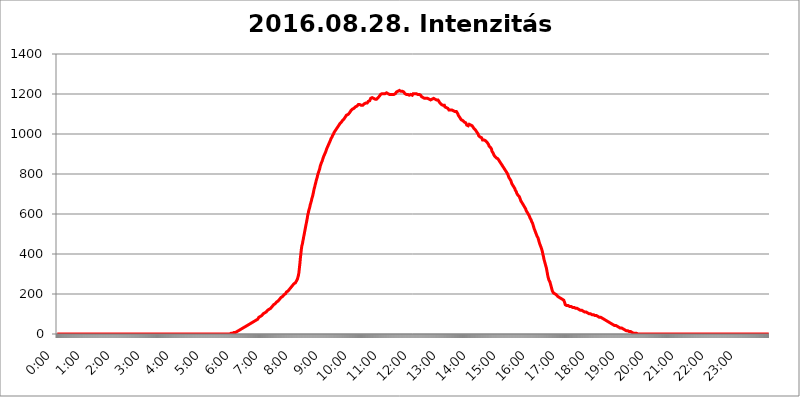
| Category | 2016.08.28. Intenzitás [W/m^2] |
|---|---|
| 0.0 | 0 |
| 0.0006944444444444445 | 0 |
| 0.001388888888888889 | 0 |
| 0.0020833333333333333 | 0 |
| 0.002777777777777778 | 0 |
| 0.003472222222222222 | 0 |
| 0.004166666666666667 | 0 |
| 0.004861111111111111 | 0 |
| 0.005555555555555556 | 0 |
| 0.0062499999999999995 | 0 |
| 0.006944444444444444 | 0 |
| 0.007638888888888889 | 0 |
| 0.008333333333333333 | 0 |
| 0.009027777777777779 | 0 |
| 0.009722222222222222 | 0 |
| 0.010416666666666666 | 0 |
| 0.011111111111111112 | 0 |
| 0.011805555555555555 | 0 |
| 0.012499999999999999 | 0 |
| 0.013194444444444444 | 0 |
| 0.013888888888888888 | 0 |
| 0.014583333333333332 | 0 |
| 0.015277777777777777 | 0 |
| 0.015972222222222224 | 0 |
| 0.016666666666666666 | 0 |
| 0.017361111111111112 | 0 |
| 0.018055555555555557 | 0 |
| 0.01875 | 0 |
| 0.019444444444444445 | 0 |
| 0.02013888888888889 | 0 |
| 0.020833333333333332 | 0 |
| 0.02152777777777778 | 0 |
| 0.022222222222222223 | 0 |
| 0.02291666666666667 | 0 |
| 0.02361111111111111 | 0 |
| 0.024305555555555556 | 0 |
| 0.024999999999999998 | 0 |
| 0.025694444444444447 | 0 |
| 0.02638888888888889 | 0 |
| 0.027083333333333334 | 0 |
| 0.027777777777777776 | 0 |
| 0.02847222222222222 | 0 |
| 0.029166666666666664 | 0 |
| 0.029861111111111113 | 0 |
| 0.030555555555555555 | 0 |
| 0.03125 | 0 |
| 0.03194444444444445 | 0 |
| 0.03263888888888889 | 0 |
| 0.03333333333333333 | 0 |
| 0.034027777777777775 | 0 |
| 0.034722222222222224 | 0 |
| 0.035416666666666666 | 0 |
| 0.036111111111111115 | 0 |
| 0.03680555555555556 | 0 |
| 0.0375 | 0 |
| 0.03819444444444444 | 0 |
| 0.03888888888888889 | 0 |
| 0.03958333333333333 | 0 |
| 0.04027777777777778 | 0 |
| 0.04097222222222222 | 0 |
| 0.041666666666666664 | 0 |
| 0.042361111111111106 | 0 |
| 0.04305555555555556 | 0 |
| 0.043750000000000004 | 0 |
| 0.044444444444444446 | 0 |
| 0.04513888888888889 | 0 |
| 0.04583333333333334 | 0 |
| 0.04652777777777778 | 0 |
| 0.04722222222222222 | 0 |
| 0.04791666666666666 | 0 |
| 0.04861111111111111 | 0 |
| 0.049305555555555554 | 0 |
| 0.049999999999999996 | 0 |
| 0.05069444444444445 | 0 |
| 0.051388888888888894 | 0 |
| 0.052083333333333336 | 0 |
| 0.05277777777777778 | 0 |
| 0.05347222222222222 | 0 |
| 0.05416666666666667 | 0 |
| 0.05486111111111111 | 0 |
| 0.05555555555555555 | 0 |
| 0.05625 | 0 |
| 0.05694444444444444 | 0 |
| 0.057638888888888885 | 0 |
| 0.05833333333333333 | 0 |
| 0.05902777777777778 | 0 |
| 0.059722222222222225 | 0 |
| 0.06041666666666667 | 0 |
| 0.061111111111111116 | 0 |
| 0.06180555555555556 | 0 |
| 0.0625 | 0 |
| 0.06319444444444444 | 0 |
| 0.06388888888888888 | 0 |
| 0.06458333333333334 | 0 |
| 0.06527777777777778 | 0 |
| 0.06597222222222222 | 0 |
| 0.06666666666666667 | 0 |
| 0.06736111111111111 | 0 |
| 0.06805555555555555 | 0 |
| 0.06874999999999999 | 0 |
| 0.06944444444444443 | 0 |
| 0.07013888888888889 | 0 |
| 0.07083333333333333 | 0 |
| 0.07152777777777779 | 0 |
| 0.07222222222222223 | 0 |
| 0.07291666666666667 | 0 |
| 0.07361111111111111 | 0 |
| 0.07430555555555556 | 0 |
| 0.075 | 0 |
| 0.07569444444444444 | 0 |
| 0.0763888888888889 | 0 |
| 0.07708333333333334 | 0 |
| 0.07777777777777778 | 0 |
| 0.07847222222222222 | 0 |
| 0.07916666666666666 | 0 |
| 0.0798611111111111 | 0 |
| 0.08055555555555556 | 0 |
| 0.08125 | 0 |
| 0.08194444444444444 | 0 |
| 0.08263888888888889 | 0 |
| 0.08333333333333333 | 0 |
| 0.08402777777777777 | 0 |
| 0.08472222222222221 | 0 |
| 0.08541666666666665 | 0 |
| 0.08611111111111112 | 0 |
| 0.08680555555555557 | 0 |
| 0.08750000000000001 | 0 |
| 0.08819444444444445 | 0 |
| 0.08888888888888889 | 0 |
| 0.08958333333333333 | 0 |
| 0.09027777777777778 | 0 |
| 0.09097222222222222 | 0 |
| 0.09166666666666667 | 0 |
| 0.09236111111111112 | 0 |
| 0.09305555555555556 | 0 |
| 0.09375 | 0 |
| 0.09444444444444444 | 0 |
| 0.09513888888888888 | 0 |
| 0.09583333333333333 | 0 |
| 0.09652777777777777 | 0 |
| 0.09722222222222222 | 0 |
| 0.09791666666666667 | 0 |
| 0.09861111111111111 | 0 |
| 0.09930555555555555 | 0 |
| 0.09999999999999999 | 0 |
| 0.10069444444444443 | 0 |
| 0.1013888888888889 | 0 |
| 0.10208333333333335 | 0 |
| 0.10277777777777779 | 0 |
| 0.10347222222222223 | 0 |
| 0.10416666666666667 | 0 |
| 0.10486111111111111 | 0 |
| 0.10555555555555556 | 0 |
| 0.10625 | 0 |
| 0.10694444444444444 | 0 |
| 0.1076388888888889 | 0 |
| 0.10833333333333334 | 0 |
| 0.10902777777777778 | 0 |
| 0.10972222222222222 | 0 |
| 0.1111111111111111 | 0 |
| 0.11180555555555556 | 0 |
| 0.11180555555555556 | 0 |
| 0.1125 | 0 |
| 0.11319444444444444 | 0 |
| 0.11388888888888889 | 0 |
| 0.11458333333333333 | 0 |
| 0.11527777777777777 | 0 |
| 0.11597222222222221 | 0 |
| 0.11666666666666665 | 0 |
| 0.1173611111111111 | 0 |
| 0.11805555555555557 | 0 |
| 0.11944444444444445 | 0 |
| 0.12013888888888889 | 0 |
| 0.12083333333333333 | 0 |
| 0.12152777777777778 | 0 |
| 0.12222222222222223 | 0 |
| 0.12291666666666667 | 0 |
| 0.12291666666666667 | 0 |
| 0.12361111111111112 | 0 |
| 0.12430555555555556 | 0 |
| 0.125 | 0 |
| 0.12569444444444444 | 0 |
| 0.12638888888888888 | 0 |
| 0.12708333333333333 | 0 |
| 0.16875 | 0 |
| 0.12847222222222224 | 0 |
| 0.12916666666666668 | 0 |
| 0.12986111111111112 | 0 |
| 0.13055555555555556 | 0 |
| 0.13125 | 0 |
| 0.13194444444444445 | 0 |
| 0.1326388888888889 | 0 |
| 0.13333333333333333 | 0 |
| 0.13402777777777777 | 0 |
| 0.13402777777777777 | 0 |
| 0.13472222222222222 | 0 |
| 0.13541666666666666 | 0 |
| 0.1361111111111111 | 0 |
| 0.13749999999999998 | 0 |
| 0.13819444444444443 | 0 |
| 0.1388888888888889 | 0 |
| 0.13958333333333334 | 0 |
| 0.14027777777777778 | 0 |
| 0.14097222222222222 | 0 |
| 0.14166666666666666 | 0 |
| 0.1423611111111111 | 0 |
| 0.14305555555555557 | 0 |
| 0.14375000000000002 | 0 |
| 0.14444444444444446 | 0 |
| 0.1451388888888889 | 0 |
| 0.1451388888888889 | 0 |
| 0.14652777777777778 | 0 |
| 0.14722222222222223 | 0 |
| 0.14791666666666667 | 0 |
| 0.1486111111111111 | 0 |
| 0.14930555555555555 | 0 |
| 0.15 | 0 |
| 0.15069444444444444 | 0 |
| 0.15138888888888888 | 0 |
| 0.15208333333333332 | 0 |
| 0.15277777777777776 | 0 |
| 0.15347222222222223 | 0 |
| 0.15416666666666667 | 0 |
| 0.15486111111111112 | 0 |
| 0.15555555555555556 | 0 |
| 0.15625 | 0 |
| 0.15694444444444444 | 0 |
| 0.15763888888888888 | 0 |
| 0.15833333333333333 | 0 |
| 0.15902777777777777 | 0 |
| 0.15972222222222224 | 0 |
| 0.16041666666666668 | 0 |
| 0.16111111111111112 | 0 |
| 0.16180555555555556 | 0 |
| 0.1625 | 0 |
| 0.16319444444444445 | 0 |
| 0.1638888888888889 | 0 |
| 0.16458333333333333 | 0 |
| 0.16527777777777777 | 0 |
| 0.16597222222222222 | 0 |
| 0.16666666666666666 | 0 |
| 0.1673611111111111 | 0 |
| 0.16805555555555554 | 0 |
| 0.16874999999999998 | 0 |
| 0.16944444444444443 | 0 |
| 0.17013888888888887 | 0 |
| 0.1708333333333333 | 0 |
| 0.17152777777777775 | 0 |
| 0.17222222222222225 | 0 |
| 0.1729166666666667 | 0 |
| 0.17361111111111113 | 0 |
| 0.17430555555555557 | 0 |
| 0.17500000000000002 | 0 |
| 0.17569444444444446 | 0 |
| 0.1763888888888889 | 0 |
| 0.17708333333333334 | 0 |
| 0.17777777777777778 | 0 |
| 0.17847222222222223 | 0 |
| 0.17916666666666667 | 0 |
| 0.1798611111111111 | 0 |
| 0.18055555555555555 | 0 |
| 0.18125 | 0 |
| 0.18194444444444444 | 0 |
| 0.1826388888888889 | 0 |
| 0.18333333333333335 | 0 |
| 0.1840277777777778 | 0 |
| 0.18472222222222223 | 0 |
| 0.18541666666666667 | 0 |
| 0.18611111111111112 | 0 |
| 0.18680555555555556 | 0 |
| 0.1875 | 0 |
| 0.18819444444444444 | 0 |
| 0.18888888888888888 | 0 |
| 0.18958333333333333 | 0 |
| 0.19027777777777777 | 0 |
| 0.1909722222222222 | 0 |
| 0.19166666666666665 | 0 |
| 0.19236111111111112 | 0 |
| 0.19305555555555554 | 0 |
| 0.19375 | 0 |
| 0.19444444444444445 | 0 |
| 0.1951388888888889 | 0 |
| 0.19583333333333333 | 0 |
| 0.19652777777777777 | 0 |
| 0.19722222222222222 | 0 |
| 0.19791666666666666 | 0 |
| 0.1986111111111111 | 0 |
| 0.19930555555555554 | 0 |
| 0.19999999999999998 | 0 |
| 0.20069444444444443 | 0 |
| 0.20138888888888887 | 0 |
| 0.2020833333333333 | 0 |
| 0.2027777777777778 | 0 |
| 0.2034722222222222 | 0 |
| 0.2041666666666667 | 0 |
| 0.20486111111111113 | 0 |
| 0.20555555555555557 | 0 |
| 0.20625000000000002 | 0 |
| 0.20694444444444446 | 0 |
| 0.2076388888888889 | 0 |
| 0.20833333333333334 | 0 |
| 0.20902777777777778 | 0 |
| 0.20972222222222223 | 0 |
| 0.21041666666666667 | 0 |
| 0.2111111111111111 | 0 |
| 0.21180555555555555 | 0 |
| 0.2125 | 0 |
| 0.21319444444444444 | 0 |
| 0.2138888888888889 | 0 |
| 0.21458333333333335 | 0 |
| 0.2152777777777778 | 0 |
| 0.21597222222222223 | 0 |
| 0.21666666666666667 | 0 |
| 0.21736111111111112 | 0 |
| 0.21805555555555556 | 0 |
| 0.21875 | 0 |
| 0.21944444444444444 | 0 |
| 0.22013888888888888 | 0 |
| 0.22083333333333333 | 0 |
| 0.22152777777777777 | 0 |
| 0.2222222222222222 | 0 |
| 0.22291666666666665 | 0 |
| 0.2236111111111111 | 0 |
| 0.22430555555555556 | 0 |
| 0.225 | 0 |
| 0.22569444444444445 | 0 |
| 0.2263888888888889 | 0 |
| 0.22708333333333333 | 0 |
| 0.22777777777777777 | 0 |
| 0.22847222222222222 | 0 |
| 0.22916666666666666 | 0 |
| 0.2298611111111111 | 0 |
| 0.23055555555555554 | 0 |
| 0.23124999999999998 | 0 |
| 0.23194444444444443 | 0 |
| 0.23263888888888887 | 0 |
| 0.2333333333333333 | 0 |
| 0.2340277777777778 | 0 |
| 0.2347222222222222 | 0 |
| 0.2354166666666667 | 0 |
| 0.23611111111111113 | 0 |
| 0.23680555555555557 | 0 |
| 0.23750000000000002 | 0 |
| 0.23819444444444446 | 0 |
| 0.2388888888888889 | 0 |
| 0.23958333333333334 | 0 |
| 0.24027777777777778 | 0 |
| 0.24097222222222223 | 0 |
| 0.24166666666666667 | 0 |
| 0.2423611111111111 | 0 |
| 0.24305555555555555 | 3.525 |
| 0.24375 | 3.525 |
| 0.24444444444444446 | 3.525 |
| 0.24513888888888888 | 3.525 |
| 0.24583333333333335 | 3.525 |
| 0.2465277777777778 | 3.525 |
| 0.24722222222222223 | 3.525 |
| 0.24791666666666667 | 7.887 |
| 0.24861111111111112 | 7.887 |
| 0.24930555555555556 | 7.887 |
| 0.25 | 7.887 |
| 0.25069444444444444 | 12.257 |
| 0.2513888888888889 | 12.257 |
| 0.2520833333333333 | 12.257 |
| 0.25277777777777777 | 12.257 |
| 0.2534722222222222 | 16.636 |
| 0.25416666666666665 | 16.636 |
| 0.2548611111111111 | 21.024 |
| 0.2555555555555556 | 21.024 |
| 0.25625000000000003 | 21.024 |
| 0.2569444444444445 | 21.024 |
| 0.2576388888888889 | 25.419 |
| 0.25833333333333336 | 25.419 |
| 0.2590277777777778 | 25.419 |
| 0.25972222222222224 | 29.823 |
| 0.2604166666666667 | 29.823 |
| 0.2611111111111111 | 29.823 |
| 0.26180555555555557 | 34.234 |
| 0.2625 | 34.234 |
| 0.26319444444444445 | 34.234 |
| 0.2638888888888889 | 38.653 |
| 0.26458333333333334 | 38.653 |
| 0.2652777777777778 | 38.653 |
| 0.2659722222222222 | 43.079 |
| 0.26666666666666666 | 43.079 |
| 0.2673611111111111 | 47.511 |
| 0.26805555555555555 | 47.511 |
| 0.26875 | 47.511 |
| 0.26944444444444443 | 47.511 |
| 0.2701388888888889 | 51.951 |
| 0.2708333333333333 | 51.951 |
| 0.27152777777777776 | 56.398 |
| 0.2722222222222222 | 56.398 |
| 0.27291666666666664 | 56.398 |
| 0.2736111111111111 | 60.85 |
| 0.2743055555555555 | 60.85 |
| 0.27499999999999997 | 60.85 |
| 0.27569444444444446 | 65.31 |
| 0.27638888888888885 | 65.31 |
| 0.27708333333333335 | 65.31 |
| 0.2777777777777778 | 69.775 |
| 0.27847222222222223 | 69.775 |
| 0.2791666666666667 | 69.775 |
| 0.2798611111111111 | 74.246 |
| 0.28055555555555556 | 74.246 |
| 0.28125 | 74.246 |
| 0.28194444444444444 | 78.722 |
| 0.2826388888888889 | 83.205 |
| 0.2833333333333333 | 83.205 |
| 0.28402777777777777 | 83.205 |
| 0.2847222222222222 | 87.692 |
| 0.28541666666666665 | 87.692 |
| 0.28611111111111115 | 92.184 |
| 0.28680555555555554 | 92.184 |
| 0.28750000000000003 | 96.682 |
| 0.2881944444444445 | 96.682 |
| 0.2888888888888889 | 101.184 |
| 0.28958333333333336 | 101.184 |
| 0.2902777777777778 | 101.184 |
| 0.29097222222222224 | 105.69 |
| 0.2916666666666667 | 105.69 |
| 0.2923611111111111 | 110.201 |
| 0.29305555555555557 | 110.201 |
| 0.29375 | 114.716 |
| 0.29444444444444445 | 114.716 |
| 0.2951388888888889 | 119.235 |
| 0.29583333333333334 | 119.235 |
| 0.2965277777777778 | 119.235 |
| 0.2972222222222222 | 123.758 |
| 0.29791666666666666 | 128.284 |
| 0.2986111111111111 | 128.284 |
| 0.29930555555555555 | 128.284 |
| 0.3 | 132.814 |
| 0.30069444444444443 | 132.814 |
| 0.3013888888888889 | 137.347 |
| 0.3020833333333333 | 137.347 |
| 0.30277777777777776 | 141.884 |
| 0.3034722222222222 | 146.423 |
| 0.30416666666666664 | 146.423 |
| 0.3048611111111111 | 146.423 |
| 0.3055555555555555 | 150.964 |
| 0.30624999999999997 | 155.509 |
| 0.3069444444444444 | 155.509 |
| 0.3076388888888889 | 160.056 |
| 0.30833333333333335 | 160.056 |
| 0.3090277777777778 | 164.605 |
| 0.30972222222222223 | 164.605 |
| 0.3104166666666667 | 169.156 |
| 0.3111111111111111 | 169.156 |
| 0.31180555555555556 | 173.709 |
| 0.3125 | 178.264 |
| 0.31319444444444444 | 178.264 |
| 0.3138888888888889 | 182.82 |
| 0.3145833333333333 | 182.82 |
| 0.31527777777777777 | 182.82 |
| 0.3159722222222222 | 187.378 |
| 0.31666666666666665 | 191.937 |
| 0.31736111111111115 | 191.937 |
| 0.31805555555555554 | 196.497 |
| 0.31875000000000003 | 201.058 |
| 0.3194444444444445 | 201.058 |
| 0.3201388888888889 | 201.058 |
| 0.32083333333333336 | 205.62 |
| 0.3215277777777778 | 210.182 |
| 0.32222222222222224 | 210.182 |
| 0.3229166666666667 | 214.746 |
| 0.3236111111111111 | 214.746 |
| 0.32430555555555557 | 219.309 |
| 0.325 | 219.309 |
| 0.32569444444444445 | 223.873 |
| 0.3263888888888889 | 228.436 |
| 0.32708333333333334 | 228.436 |
| 0.3277777777777778 | 233 |
| 0.3284722222222222 | 233 |
| 0.32916666666666666 | 237.564 |
| 0.3298611111111111 | 242.127 |
| 0.33055555555555555 | 242.127 |
| 0.33125 | 246.689 |
| 0.33194444444444443 | 251.251 |
| 0.3326388888888889 | 251.251 |
| 0.3333333333333333 | 255.813 |
| 0.3340277777777778 | 255.813 |
| 0.3347222222222222 | 260.373 |
| 0.3354166666666667 | 264.932 |
| 0.3361111111111111 | 269.49 |
| 0.3368055555555556 | 274.047 |
| 0.33749999999999997 | 283.156 |
| 0.33819444444444446 | 292.259 |
| 0.33888888888888885 | 305.898 |
| 0.33958333333333335 | 328.584 |
| 0.34027777777777773 | 351.198 |
| 0.34097222222222223 | 378.224 |
| 0.3416666666666666 | 400.638 |
| 0.3423611111111111 | 422.943 |
| 0.3430555555555555 | 440.702 |
| 0.34375 | 449.551 |
| 0.3444444444444445 | 462.786 |
| 0.3451388888888889 | 475.972 |
| 0.3458333333333334 | 489.108 |
| 0.34652777777777777 | 502.192 |
| 0.34722222222222227 | 515.223 |
| 0.34791666666666665 | 528.2 |
| 0.34861111111111115 | 541.121 |
| 0.34930555555555554 | 553.986 |
| 0.35000000000000003 | 566.793 |
| 0.3506944444444444 | 579.542 |
| 0.3513888888888889 | 596.45 |
| 0.3520833333333333 | 604.864 |
| 0.3527777777777778 | 617.436 |
| 0.3534722222222222 | 625.784 |
| 0.3541666666666667 | 634.105 |
| 0.3548611111111111 | 646.537 |
| 0.35555555555555557 | 654.791 |
| 0.35625 | 663.019 |
| 0.35694444444444445 | 675.311 |
| 0.3576388888888889 | 683.473 |
| 0.35833333333333334 | 691.608 |
| 0.3590277777777778 | 703.762 |
| 0.3597222222222222 | 715.858 |
| 0.36041666666666666 | 727.896 |
| 0.3611111111111111 | 735.89 |
| 0.36180555555555555 | 747.834 |
| 0.3625 | 755.766 |
| 0.36319444444444443 | 767.62 |
| 0.3638888888888889 | 775.492 |
| 0.3645833333333333 | 783.342 |
| 0.3652777777777778 | 795.074 |
| 0.3659722222222222 | 802.868 |
| 0.3666666666666667 | 810.641 |
| 0.3673611111111111 | 818.392 |
| 0.3680555555555556 | 826.123 |
| 0.36874999999999997 | 837.682 |
| 0.36944444444444446 | 845.365 |
| 0.37013888888888885 | 853.029 |
| 0.37083333333333335 | 856.855 |
| 0.37152777777777773 | 864.493 |
| 0.37222222222222223 | 872.114 |
| 0.3729166666666666 | 879.719 |
| 0.3736111111111111 | 887.309 |
| 0.3743055555555555 | 891.099 |
| 0.375 | 898.668 |
| 0.3756944444444445 | 902.447 |
| 0.3763888888888889 | 909.996 |
| 0.3770833333333334 | 917.534 |
| 0.37777777777777777 | 925.06 |
| 0.37847222222222227 | 928.819 |
| 0.37916666666666665 | 936.33 |
| 0.37986111111111115 | 940.082 |
| 0.38055555555555554 | 947.58 |
| 0.38125000000000003 | 951.327 |
| 0.3819444444444444 | 958.814 |
| 0.3826388888888889 | 962.555 |
| 0.3833333333333333 | 970.034 |
| 0.3840277777777778 | 977.508 |
| 0.3847222222222222 | 981.244 |
| 0.3854166666666667 | 984.98 |
| 0.3861111111111111 | 992.448 |
| 0.38680555555555557 | 992.448 |
| 0.3875 | 999.916 |
| 0.38819444444444445 | 1007.383 |
| 0.3888888888888889 | 1007.383 |
| 0.38958333333333334 | 1014.852 |
| 0.3902777777777778 | 1018.587 |
| 0.3909722222222222 | 1022.323 |
| 0.39166666666666666 | 1026.06 |
| 0.3923611111111111 | 1029.798 |
| 0.39305555555555555 | 1033.537 |
| 0.39375 | 1037.277 |
| 0.39444444444444443 | 1041.019 |
| 0.3951388888888889 | 1044.762 |
| 0.3958333333333333 | 1048.508 |
| 0.3965277777777778 | 1052.255 |
| 0.3972222222222222 | 1052.255 |
| 0.3979166666666667 | 1056.004 |
| 0.3986111111111111 | 1059.756 |
| 0.3993055555555556 | 1063.51 |
| 0.39999999999999997 | 1067.267 |
| 0.40069444444444446 | 1067.267 |
| 0.40138888888888885 | 1071.027 |
| 0.40208333333333335 | 1074.789 |
| 0.40277777777777773 | 1078.555 |
| 0.40347222222222223 | 1082.324 |
| 0.4041666666666666 | 1086.097 |
| 0.4048611111111111 | 1086.097 |
| 0.4055555555555555 | 1093.653 |
| 0.40625 | 1093.653 |
| 0.4069444444444445 | 1093.653 |
| 0.4076388888888889 | 1097.437 |
| 0.4083333333333334 | 1101.226 |
| 0.40902777777777777 | 1101.226 |
| 0.40972222222222227 | 1105.019 |
| 0.41041666666666665 | 1108.816 |
| 0.41111111111111115 | 1108.816 |
| 0.41180555555555554 | 1116.426 |
| 0.41250000000000003 | 1116.426 |
| 0.4131944444444444 | 1120.238 |
| 0.4138888888888889 | 1124.056 |
| 0.4145833333333333 | 1124.056 |
| 0.4152777777777778 | 1124.056 |
| 0.4159722222222222 | 1127.879 |
| 0.4166666666666667 | 1127.879 |
| 0.4173611111111111 | 1131.708 |
| 0.41805555555555557 | 1135.543 |
| 0.41875 | 1135.543 |
| 0.41944444444444445 | 1135.543 |
| 0.4201388888888889 | 1139.384 |
| 0.42083333333333334 | 1143.232 |
| 0.4215277777777778 | 1143.232 |
| 0.4222222222222222 | 1147.086 |
| 0.42291666666666666 | 1147.086 |
| 0.4236111111111111 | 1147.086 |
| 0.42430555555555555 | 1147.086 |
| 0.425 | 1143.232 |
| 0.42569444444444443 | 1143.232 |
| 0.4263888888888889 | 1143.232 |
| 0.4270833333333333 | 1143.232 |
| 0.4277777777777778 | 1143.232 |
| 0.4284722222222222 | 1143.232 |
| 0.4291666666666667 | 1147.086 |
| 0.4298611111111111 | 1147.086 |
| 0.4305555555555556 | 1150.946 |
| 0.43124999999999997 | 1150.946 |
| 0.43194444444444446 | 1154.814 |
| 0.43263888888888885 | 1154.814 |
| 0.43333333333333335 | 1154.814 |
| 0.43402777777777773 | 1158.689 |
| 0.43472222222222223 | 1154.814 |
| 0.4354166666666666 | 1158.689 |
| 0.4361111111111111 | 1162.571 |
| 0.4368055555555555 | 1162.571 |
| 0.4375 | 1166.46 |
| 0.4381944444444445 | 1166.46 |
| 0.4388888888888889 | 1170.358 |
| 0.4395833333333334 | 1178.177 |
| 0.44027777777777777 | 1178.177 |
| 0.44097222222222227 | 1182.099 |
| 0.44166666666666665 | 1182.099 |
| 0.44236111111111115 | 1182.099 |
| 0.44305555555555554 | 1178.177 |
| 0.44375000000000003 | 1178.177 |
| 0.4444444444444444 | 1178.177 |
| 0.4451388888888889 | 1174.263 |
| 0.4458333333333333 | 1174.263 |
| 0.4465277777777778 | 1174.263 |
| 0.4472222222222222 | 1174.263 |
| 0.4479166666666667 | 1174.263 |
| 0.4486111111111111 | 1178.177 |
| 0.44930555555555557 | 1178.177 |
| 0.45 | 1182.099 |
| 0.45069444444444445 | 1182.099 |
| 0.4513888888888889 | 1186.03 |
| 0.45208333333333334 | 1189.969 |
| 0.4527777777777778 | 1193.918 |
| 0.4534722222222222 | 1197.876 |
| 0.45416666666666666 | 1197.876 |
| 0.4548611111111111 | 1197.876 |
| 0.45555555555555555 | 1201.843 |
| 0.45625 | 1201.843 |
| 0.45694444444444443 | 1201.843 |
| 0.4576388888888889 | 1201.843 |
| 0.4583333333333333 | 1201.843 |
| 0.4590277777777778 | 1205.82 |
| 0.4597222222222222 | 1201.843 |
| 0.4604166666666667 | 1205.82 |
| 0.4611111111111111 | 1205.82 |
| 0.4618055555555556 | 1205.82 |
| 0.46249999999999997 | 1205.82 |
| 0.46319444444444446 | 1205.82 |
| 0.46388888888888885 | 1201.843 |
| 0.46458333333333335 | 1197.876 |
| 0.46527777777777773 | 1197.876 |
| 0.46597222222222223 | 1197.876 |
| 0.4666666666666666 | 1197.876 |
| 0.4673611111111111 | 1197.876 |
| 0.4680555555555555 | 1197.876 |
| 0.46875 | 1197.876 |
| 0.4694444444444445 | 1197.876 |
| 0.4701388888888889 | 1197.876 |
| 0.4708333333333334 | 1197.876 |
| 0.47152777777777777 | 1197.876 |
| 0.47222222222222227 | 1197.876 |
| 0.47291666666666665 | 1197.876 |
| 0.47361111111111115 | 1197.876 |
| 0.47430555555555554 | 1201.843 |
| 0.47500000000000003 | 1205.82 |
| 0.4756944444444444 | 1209.807 |
| 0.4763888888888889 | 1213.804 |
| 0.4770833333333333 | 1213.804 |
| 0.4777777777777778 | 1213.804 |
| 0.4784722222222222 | 1217.812 |
| 0.4791666666666667 | 1217.812 |
| 0.4798611111111111 | 1217.812 |
| 0.48055555555555557 | 1213.804 |
| 0.48125 | 1213.804 |
| 0.48194444444444445 | 1213.804 |
| 0.4826388888888889 | 1213.804 |
| 0.48333333333333334 | 1213.804 |
| 0.4840277777777778 | 1213.804 |
| 0.4847222222222222 | 1213.804 |
| 0.48541666666666666 | 1209.807 |
| 0.4861111111111111 | 1209.807 |
| 0.48680555555555555 | 1205.82 |
| 0.4875 | 1201.843 |
| 0.48819444444444443 | 1201.843 |
| 0.4888888888888889 | 1201.843 |
| 0.4895833333333333 | 1197.876 |
| 0.4902777777777778 | 1197.876 |
| 0.4909722222222222 | 1197.876 |
| 0.4916666666666667 | 1197.876 |
| 0.4923611111111111 | 1197.876 |
| 0.4930555555555556 | 1197.876 |
| 0.49374999999999997 | 1193.918 |
| 0.49444444444444446 | 1197.876 |
| 0.49513888888888885 | 1193.918 |
| 0.49583333333333335 | 1197.876 |
| 0.49652777777777773 | 1193.918 |
| 0.49722222222222223 | 1193.918 |
| 0.4979166666666666 | 1193.918 |
| 0.4986111111111111 | 1197.876 |
| 0.4993055555555555 | 1201.843 |
| 0.5 | 1197.876 |
| 0.5006944444444444 | 1201.843 |
| 0.5013888888888889 | 1201.843 |
| 0.5020833333333333 | 1201.843 |
| 0.5027777777777778 | 1201.843 |
| 0.5034722222222222 | 1201.843 |
| 0.5041666666666667 | 1201.843 |
| 0.5048611111111111 | 1197.876 |
| 0.5055555555555555 | 1197.876 |
| 0.50625 | 1197.876 |
| 0.5069444444444444 | 1197.876 |
| 0.5076388888888889 | 1197.876 |
| 0.5083333333333333 | 1197.876 |
| 0.5090277777777777 | 1197.876 |
| 0.5097222222222222 | 1193.918 |
| 0.5104166666666666 | 1189.969 |
| 0.5111111111111112 | 1186.03 |
| 0.5118055555555555 | 1186.03 |
| 0.5125000000000001 | 1182.099 |
| 0.5131944444444444 | 1182.099 |
| 0.513888888888889 | 1178.177 |
| 0.5145833333333333 | 1178.177 |
| 0.5152777777777778 | 1178.177 |
| 0.5159722222222222 | 1178.177 |
| 0.5166666666666667 | 1178.177 |
| 0.517361111111111 | 1178.177 |
| 0.5180555555555556 | 1178.177 |
| 0.5187499999999999 | 1182.099 |
| 0.5194444444444445 | 1178.177 |
| 0.5201388888888888 | 1178.177 |
| 0.5208333333333334 | 1174.263 |
| 0.5215277777777778 | 1174.263 |
| 0.5222222222222223 | 1170.358 |
| 0.5229166666666667 | 1170.358 |
| 0.5236111111111111 | 1170.358 |
| 0.5243055555555556 | 1170.358 |
| 0.525 | 1174.263 |
| 0.5256944444444445 | 1174.263 |
| 0.5263888888888889 | 1178.177 |
| 0.5270833333333333 | 1178.177 |
| 0.5277777777777778 | 1178.177 |
| 0.5284722222222222 | 1174.263 |
| 0.5291666666666667 | 1174.263 |
| 0.5298611111111111 | 1174.263 |
| 0.5305555555555556 | 1174.263 |
| 0.53125 | 1174.263 |
| 0.5319444444444444 | 1170.358 |
| 0.5326388888888889 | 1170.358 |
| 0.5333333333333333 | 1170.358 |
| 0.5340277777777778 | 1170.358 |
| 0.5347222222222222 | 1166.46 |
| 0.5354166666666667 | 1162.571 |
| 0.5361111111111111 | 1158.689 |
| 0.5368055555555555 | 1154.814 |
| 0.5375 | 1154.814 |
| 0.5381944444444444 | 1150.946 |
| 0.5388888888888889 | 1147.086 |
| 0.5395833333333333 | 1147.086 |
| 0.5402777777777777 | 1143.232 |
| 0.5409722222222222 | 1143.232 |
| 0.5416666666666666 | 1139.384 |
| 0.5423611111111112 | 1139.384 |
| 0.5430555555555555 | 1143.232 |
| 0.5437500000000001 | 1135.543 |
| 0.5444444444444444 | 1135.543 |
| 0.545138888888889 | 1135.543 |
| 0.5458333333333333 | 1131.708 |
| 0.5465277777777778 | 1131.708 |
| 0.5472222222222222 | 1131.708 |
| 0.5479166666666667 | 1127.879 |
| 0.548611111111111 | 1124.056 |
| 0.5493055555555556 | 1120.238 |
| 0.5499999999999999 | 1120.238 |
| 0.5506944444444445 | 1124.056 |
| 0.5513888888888888 | 1120.238 |
| 0.5520833333333334 | 1124.056 |
| 0.5527777777777778 | 1124.056 |
| 0.5534722222222223 | 1120.238 |
| 0.5541666666666667 | 1116.426 |
| 0.5548611111111111 | 1116.426 |
| 0.5555555555555556 | 1116.426 |
| 0.55625 | 1116.426 |
| 0.5569444444444445 | 1112.618 |
| 0.5576388888888889 | 1112.618 |
| 0.5583333333333333 | 1108.816 |
| 0.5590277777777778 | 1112.618 |
| 0.5597222222222222 | 1112.618 |
| 0.5604166666666667 | 1108.816 |
| 0.5611111111111111 | 1108.816 |
| 0.5618055555555556 | 1101.226 |
| 0.5625 | 1093.653 |
| 0.5631944444444444 | 1089.873 |
| 0.5638888888888889 | 1086.097 |
| 0.5645833333333333 | 1086.097 |
| 0.5652777777777778 | 1078.555 |
| 0.5659722222222222 | 1078.555 |
| 0.5666666666666667 | 1071.027 |
| 0.5673611111111111 | 1067.267 |
| 0.5680555555555555 | 1067.267 |
| 0.56875 | 1067.267 |
| 0.5694444444444444 | 1067.267 |
| 0.5701388888888889 | 1063.51 |
| 0.5708333333333333 | 1059.756 |
| 0.5715277777777777 | 1059.756 |
| 0.5722222222222222 | 1059.756 |
| 0.5729166666666666 | 1056.004 |
| 0.5736111111111112 | 1052.255 |
| 0.5743055555555555 | 1044.762 |
| 0.5750000000000001 | 1044.762 |
| 0.5756944444444444 | 1041.019 |
| 0.576388888888889 | 1041.019 |
| 0.5770833333333333 | 1044.762 |
| 0.5777777777777778 | 1048.508 |
| 0.5784722222222222 | 1048.508 |
| 0.5791666666666667 | 1044.762 |
| 0.579861111111111 | 1044.762 |
| 0.5805555555555556 | 1044.762 |
| 0.5812499999999999 | 1044.762 |
| 0.5819444444444445 | 1041.019 |
| 0.5826388888888888 | 1041.019 |
| 0.5833333333333334 | 1037.277 |
| 0.5840277777777778 | 1029.798 |
| 0.5847222222222223 | 1026.06 |
| 0.5854166666666667 | 1026.06 |
| 0.5861111111111111 | 1022.323 |
| 0.5868055555555556 | 1018.587 |
| 0.5875 | 1014.852 |
| 0.5881944444444445 | 1014.852 |
| 0.5888888888888889 | 1007.383 |
| 0.5895833333333333 | 1003.65 |
| 0.5902777777777778 | 999.916 |
| 0.5909722222222222 | 992.448 |
| 0.5916666666666667 | 988.714 |
| 0.5923611111111111 | 988.714 |
| 0.5930555555555556 | 984.98 |
| 0.59375 | 984.98 |
| 0.5944444444444444 | 981.244 |
| 0.5951388888888889 | 981.244 |
| 0.5958333333333333 | 977.508 |
| 0.5965277777777778 | 970.034 |
| 0.5972222222222222 | 970.034 |
| 0.5979166666666667 | 970.034 |
| 0.5986111111111111 | 970.034 |
| 0.5993055555555555 | 970.034 |
| 0.6 | 970.034 |
| 0.6006944444444444 | 966.295 |
| 0.6013888888888889 | 966.295 |
| 0.6020833333333333 | 962.555 |
| 0.6027777777777777 | 958.814 |
| 0.6034722222222222 | 955.071 |
| 0.6041666666666666 | 955.071 |
| 0.6048611111111112 | 947.58 |
| 0.6055555555555555 | 940.082 |
| 0.6062500000000001 | 940.082 |
| 0.6069444444444444 | 936.33 |
| 0.607638888888889 | 932.576 |
| 0.6083333333333333 | 928.819 |
| 0.6090277777777778 | 925.06 |
| 0.6097222222222222 | 913.766 |
| 0.6104166666666667 | 913.766 |
| 0.611111111111111 | 906.223 |
| 0.6118055555555556 | 902.447 |
| 0.6124999999999999 | 894.885 |
| 0.6131944444444445 | 894.885 |
| 0.6138888888888888 | 887.309 |
| 0.6145833333333334 | 887.309 |
| 0.6152777777777778 | 883.516 |
| 0.6159722222222223 | 879.719 |
| 0.6166666666666667 | 879.719 |
| 0.6173611111111111 | 875.918 |
| 0.6180555555555556 | 875.918 |
| 0.61875 | 872.114 |
| 0.6194444444444445 | 868.305 |
| 0.6201388888888889 | 864.493 |
| 0.6208333333333333 | 860.676 |
| 0.6215277777777778 | 856.855 |
| 0.6222222222222222 | 853.029 |
| 0.6229166666666667 | 849.199 |
| 0.6236111111111111 | 845.365 |
| 0.6243055555555556 | 841.526 |
| 0.625 | 837.682 |
| 0.6256944444444444 | 837.682 |
| 0.6263888888888889 | 829.981 |
| 0.6270833333333333 | 829.981 |
| 0.6277777777777778 | 826.123 |
| 0.6284722222222222 | 818.392 |
| 0.6291666666666667 | 814.519 |
| 0.6298611111111111 | 810.641 |
| 0.6305555555555555 | 806.757 |
| 0.63125 | 802.868 |
| 0.6319444444444444 | 798.974 |
| 0.6326388888888889 | 791.169 |
| 0.6333333333333333 | 783.342 |
| 0.6340277777777777 | 779.42 |
| 0.6347222222222222 | 775.492 |
| 0.6354166666666666 | 771.559 |
| 0.6361111111111112 | 767.62 |
| 0.6368055555555555 | 759.723 |
| 0.6375000000000001 | 751.803 |
| 0.6381944444444444 | 747.834 |
| 0.638888888888889 | 743.859 |
| 0.6395833333333333 | 739.877 |
| 0.6402777777777778 | 735.89 |
| 0.6409722222222222 | 731.896 |
| 0.6416666666666667 | 727.896 |
| 0.642361111111111 | 719.877 |
| 0.6430555555555556 | 715.858 |
| 0.6437499999999999 | 711.832 |
| 0.6444444444444445 | 703.762 |
| 0.6451388888888888 | 703.762 |
| 0.6458333333333334 | 695.666 |
| 0.6465277777777778 | 695.666 |
| 0.6472222222222223 | 691.608 |
| 0.6479166666666667 | 687.544 |
| 0.6486111111111111 | 683.473 |
| 0.6493055555555556 | 675.311 |
| 0.65 | 667.123 |
| 0.6506944444444445 | 667.123 |
| 0.6513888888888889 | 658.909 |
| 0.6520833333333333 | 654.791 |
| 0.6527777777777778 | 650.667 |
| 0.6534722222222222 | 646.537 |
| 0.6541666666666667 | 642.4 |
| 0.6548611111111111 | 638.256 |
| 0.6555555555555556 | 634.105 |
| 0.65625 | 629.948 |
| 0.6569444444444444 | 625.784 |
| 0.6576388888888889 | 617.436 |
| 0.6583333333333333 | 613.252 |
| 0.6590277777777778 | 609.062 |
| 0.6597222222222222 | 604.864 |
| 0.6604166666666667 | 600.661 |
| 0.6611111111111111 | 596.45 |
| 0.6618055555555555 | 592.233 |
| 0.6625 | 588.009 |
| 0.6631944444444444 | 579.542 |
| 0.6638888888888889 | 575.299 |
| 0.6645833333333333 | 571.049 |
| 0.6652777777777777 | 562.53 |
| 0.6659722222222222 | 558.261 |
| 0.6666666666666666 | 553.986 |
| 0.6673611111111111 | 545.416 |
| 0.6680555555555556 | 536.82 |
| 0.6687500000000001 | 528.2 |
| 0.6694444444444444 | 523.88 |
| 0.6701388888888888 | 515.223 |
| 0.6708333333333334 | 510.885 |
| 0.6715277777777778 | 502.192 |
| 0.6722222222222222 | 497.836 |
| 0.6729166666666666 | 489.108 |
| 0.6736111111111112 | 484.735 |
| 0.6743055555555556 | 480.356 |
| 0.6749999999999999 | 471.582 |
| 0.6756944444444444 | 462.786 |
| 0.6763888888888889 | 453.968 |
| 0.6770833333333334 | 449.551 |
| 0.6777777777777777 | 440.702 |
| 0.6784722222222223 | 436.27 |
| 0.6791666666666667 | 427.39 |
| 0.6798611111111111 | 418.492 |
| 0.6805555555555555 | 409.574 |
| 0.68125 | 396.164 |
| 0.6819444444444445 | 387.202 |
| 0.6826388888888889 | 373.729 |
| 0.6833333333333332 | 364.728 |
| 0.6840277777777778 | 355.712 |
| 0.6847222222222222 | 346.682 |
| 0.6854166666666667 | 337.639 |
| 0.686111111111111 | 328.584 |
| 0.6868055555555556 | 314.98 |
| 0.6875 | 301.354 |
| 0.6881944444444444 | 287.709 |
| 0.688888888888889 | 278.603 |
| 0.6895833333333333 | 269.49 |
| 0.6902777777777778 | 264.932 |
| 0.6909722222222222 | 260.373 |
| 0.6916666666666668 | 255.813 |
| 0.6923611111111111 | 242.127 |
| 0.6930555555555555 | 233 |
| 0.69375 | 223.873 |
| 0.6944444444444445 | 214.746 |
| 0.6951388888888889 | 210.182 |
| 0.6958333333333333 | 205.62 |
| 0.6965277777777777 | 205.62 |
| 0.6972222222222223 | 205.62 |
| 0.6979166666666666 | 201.058 |
| 0.6986111111111111 | 201.058 |
| 0.6993055555555556 | 196.497 |
| 0.7000000000000001 | 196.497 |
| 0.7006944444444444 | 191.937 |
| 0.7013888888888888 | 191.937 |
| 0.7020833333333334 | 187.378 |
| 0.7027777777777778 | 187.378 |
| 0.7034722222222222 | 182.82 |
| 0.7041666666666666 | 182.82 |
| 0.7048611111111112 | 182.82 |
| 0.7055555555555556 | 182.82 |
| 0.7062499999999999 | 178.264 |
| 0.7069444444444444 | 178.264 |
| 0.7076388888888889 | 178.264 |
| 0.7083333333333334 | 173.709 |
| 0.7090277777777777 | 169.156 |
| 0.7097222222222223 | 169.156 |
| 0.7104166666666667 | 169.156 |
| 0.7111111111111111 | 164.605 |
| 0.7118055555555555 | 155.509 |
| 0.7125 | 146.423 |
| 0.7131944444444445 | 146.423 |
| 0.7138888888888889 | 141.884 |
| 0.7145833333333332 | 141.884 |
| 0.7152777777777778 | 141.884 |
| 0.7159722222222222 | 141.884 |
| 0.7166666666666667 | 141.884 |
| 0.717361111111111 | 137.347 |
| 0.7180555555555556 | 137.347 |
| 0.71875 | 137.347 |
| 0.7194444444444444 | 137.347 |
| 0.720138888888889 | 137.347 |
| 0.7208333333333333 | 137.347 |
| 0.7215277777777778 | 137.347 |
| 0.7222222222222222 | 137.347 |
| 0.7229166666666668 | 132.814 |
| 0.7236111111111111 | 132.814 |
| 0.7243055555555555 | 132.814 |
| 0.725 | 132.814 |
| 0.7256944444444445 | 128.284 |
| 0.7263888888888889 | 128.284 |
| 0.7270833333333333 | 128.284 |
| 0.7277777777777777 | 128.284 |
| 0.7284722222222223 | 128.284 |
| 0.7291666666666666 | 128.284 |
| 0.7298611111111111 | 123.758 |
| 0.7305555555555556 | 123.758 |
| 0.7312500000000001 | 123.758 |
| 0.7319444444444444 | 123.758 |
| 0.7326388888888888 | 119.235 |
| 0.7333333333333334 | 119.235 |
| 0.7340277777777778 | 119.235 |
| 0.7347222222222222 | 119.235 |
| 0.7354166666666666 | 119.235 |
| 0.7361111111111112 | 114.716 |
| 0.7368055555555556 | 114.716 |
| 0.7374999999999999 | 114.716 |
| 0.7381944444444444 | 114.716 |
| 0.7388888888888889 | 110.201 |
| 0.7395833333333334 | 110.201 |
| 0.7402777777777777 | 110.201 |
| 0.7409722222222223 | 110.201 |
| 0.7416666666666667 | 110.201 |
| 0.7423611111111111 | 105.69 |
| 0.7430555555555555 | 105.69 |
| 0.74375 | 105.69 |
| 0.7444444444444445 | 105.69 |
| 0.7451388888888889 | 105.69 |
| 0.7458333333333332 | 101.184 |
| 0.7465277777777778 | 101.184 |
| 0.7472222222222222 | 101.184 |
| 0.7479166666666667 | 101.184 |
| 0.748611111111111 | 101.184 |
| 0.7493055555555556 | 101.184 |
| 0.75 | 96.682 |
| 0.7506944444444444 | 96.682 |
| 0.751388888888889 | 96.682 |
| 0.7520833333333333 | 96.682 |
| 0.7527777777777778 | 96.682 |
| 0.7534722222222222 | 96.682 |
| 0.7541666666666668 | 92.184 |
| 0.7548611111111111 | 92.184 |
| 0.7555555555555555 | 92.184 |
| 0.75625 | 92.184 |
| 0.7569444444444445 | 92.184 |
| 0.7576388888888889 | 87.692 |
| 0.7583333333333333 | 87.692 |
| 0.7590277777777777 | 87.692 |
| 0.7597222222222223 | 87.692 |
| 0.7604166666666666 | 83.205 |
| 0.7611111111111111 | 83.205 |
| 0.7618055555555556 | 83.205 |
| 0.7625000000000001 | 83.205 |
| 0.7631944444444444 | 78.722 |
| 0.7638888888888888 | 78.722 |
| 0.7645833333333334 | 78.722 |
| 0.7652777777777778 | 78.722 |
| 0.7659722222222222 | 74.246 |
| 0.7666666666666666 | 74.246 |
| 0.7673611111111112 | 74.246 |
| 0.7680555555555556 | 69.775 |
| 0.7687499999999999 | 69.775 |
| 0.7694444444444444 | 69.775 |
| 0.7701388888888889 | 65.31 |
| 0.7708333333333334 | 65.31 |
| 0.7715277777777777 | 65.31 |
| 0.7722222222222223 | 60.85 |
| 0.7729166666666667 | 60.85 |
| 0.7736111111111111 | 60.85 |
| 0.7743055555555555 | 56.398 |
| 0.775 | 56.398 |
| 0.7756944444444445 | 56.398 |
| 0.7763888888888889 | 56.398 |
| 0.7770833333333332 | 51.951 |
| 0.7777777777777778 | 51.951 |
| 0.7784722222222222 | 47.511 |
| 0.7791666666666667 | 47.511 |
| 0.779861111111111 | 47.511 |
| 0.7805555555555556 | 47.511 |
| 0.78125 | 43.079 |
| 0.7819444444444444 | 43.079 |
| 0.782638888888889 | 43.079 |
| 0.7833333333333333 | 43.079 |
| 0.7840277777777778 | 38.653 |
| 0.7847222222222222 | 38.653 |
| 0.7854166666666668 | 38.653 |
| 0.7861111111111111 | 38.653 |
| 0.7868055555555555 | 34.234 |
| 0.7875 | 34.234 |
| 0.7881944444444445 | 34.234 |
| 0.7888888888888889 | 29.823 |
| 0.7895833333333333 | 29.823 |
| 0.7902777777777777 | 29.823 |
| 0.7909722222222223 | 29.823 |
| 0.7916666666666666 | 29.823 |
| 0.7923611111111111 | 25.419 |
| 0.7930555555555556 | 25.419 |
| 0.7937500000000001 | 25.419 |
| 0.7944444444444444 | 25.419 |
| 0.7951388888888888 | 21.024 |
| 0.7958333333333334 | 21.024 |
| 0.7965277777777778 | 21.024 |
| 0.7972222222222222 | 21.024 |
| 0.7979166666666666 | 16.636 |
| 0.7986111111111112 | 16.636 |
| 0.7993055555555556 | 16.636 |
| 0.7999999999999999 | 16.636 |
| 0.8006944444444444 | 12.257 |
| 0.8013888888888889 | 12.257 |
| 0.8020833333333334 | 12.257 |
| 0.8027777777777777 | 12.257 |
| 0.8034722222222223 | 12.257 |
| 0.8041666666666667 | 12.257 |
| 0.8048611111111111 | 7.887 |
| 0.8055555555555555 | 7.887 |
| 0.80625 | 7.887 |
| 0.8069444444444445 | 7.887 |
| 0.8076388888888889 | 7.887 |
| 0.8083333333333332 | 3.525 |
| 0.8090277777777778 | 3.525 |
| 0.8097222222222222 | 3.525 |
| 0.8104166666666667 | 3.525 |
| 0.811111111111111 | 3.525 |
| 0.8118055555555556 | 3.525 |
| 0.8125 | 3.525 |
| 0.8131944444444444 | 0 |
| 0.813888888888889 | 0 |
| 0.8145833333333333 | 0 |
| 0.8152777777777778 | 0 |
| 0.8159722222222222 | 0 |
| 0.8166666666666668 | 0 |
| 0.8173611111111111 | 0 |
| 0.8180555555555555 | 0 |
| 0.81875 | 0 |
| 0.8194444444444445 | 0 |
| 0.8201388888888889 | 0 |
| 0.8208333333333333 | 0 |
| 0.8215277777777777 | 0 |
| 0.8222222222222223 | 0 |
| 0.8229166666666666 | 0 |
| 0.8236111111111111 | 0 |
| 0.8243055555555556 | 0 |
| 0.8250000000000001 | 0 |
| 0.8256944444444444 | 0 |
| 0.8263888888888888 | 0 |
| 0.8270833333333334 | 0 |
| 0.8277777777777778 | 0 |
| 0.8284722222222222 | 0 |
| 0.8291666666666666 | 0 |
| 0.8298611111111112 | 0 |
| 0.8305555555555556 | 0 |
| 0.8312499999999999 | 0 |
| 0.8319444444444444 | 0 |
| 0.8326388888888889 | 0 |
| 0.8333333333333334 | 0 |
| 0.8340277777777777 | 0 |
| 0.8347222222222223 | 0 |
| 0.8354166666666667 | 0 |
| 0.8361111111111111 | 0 |
| 0.8368055555555555 | 0 |
| 0.8375 | 0 |
| 0.8381944444444445 | 0 |
| 0.8388888888888889 | 0 |
| 0.8395833333333332 | 0 |
| 0.8402777777777778 | 0 |
| 0.8409722222222222 | 0 |
| 0.8416666666666667 | 0 |
| 0.842361111111111 | 0 |
| 0.8430555555555556 | 0 |
| 0.84375 | 0 |
| 0.8444444444444444 | 0 |
| 0.845138888888889 | 0 |
| 0.8458333333333333 | 0 |
| 0.8465277777777778 | 0 |
| 0.8472222222222222 | 0 |
| 0.8479166666666668 | 0 |
| 0.8486111111111111 | 0 |
| 0.8493055555555555 | 0 |
| 0.85 | 0 |
| 0.8506944444444445 | 0 |
| 0.8513888888888889 | 0 |
| 0.8520833333333333 | 0 |
| 0.8527777777777777 | 0 |
| 0.8534722222222223 | 0 |
| 0.8541666666666666 | 0 |
| 0.8548611111111111 | 0 |
| 0.8555555555555556 | 0 |
| 0.8562500000000001 | 0 |
| 0.8569444444444444 | 0 |
| 0.8576388888888888 | 0 |
| 0.8583333333333334 | 0 |
| 0.8590277777777778 | 0 |
| 0.8597222222222222 | 0 |
| 0.8604166666666666 | 0 |
| 0.8611111111111112 | 0 |
| 0.8618055555555556 | 0 |
| 0.8624999999999999 | 0 |
| 0.8631944444444444 | 0 |
| 0.8638888888888889 | 0 |
| 0.8645833333333334 | 0 |
| 0.8652777777777777 | 0 |
| 0.8659722222222223 | 0 |
| 0.8666666666666667 | 0 |
| 0.8673611111111111 | 0 |
| 0.8680555555555555 | 0 |
| 0.86875 | 0 |
| 0.8694444444444445 | 0 |
| 0.8701388888888889 | 0 |
| 0.8708333333333332 | 0 |
| 0.8715277777777778 | 0 |
| 0.8722222222222222 | 0 |
| 0.8729166666666667 | 0 |
| 0.873611111111111 | 0 |
| 0.8743055555555556 | 0 |
| 0.875 | 0 |
| 0.8756944444444444 | 0 |
| 0.876388888888889 | 0 |
| 0.8770833333333333 | 0 |
| 0.8777777777777778 | 0 |
| 0.8784722222222222 | 0 |
| 0.8791666666666668 | 0 |
| 0.8798611111111111 | 0 |
| 0.8805555555555555 | 0 |
| 0.88125 | 0 |
| 0.8819444444444445 | 0 |
| 0.8826388888888889 | 0 |
| 0.8833333333333333 | 0 |
| 0.8840277777777777 | 0 |
| 0.8847222222222223 | 0 |
| 0.8854166666666666 | 0 |
| 0.8861111111111111 | 0 |
| 0.8868055555555556 | 0 |
| 0.8875000000000001 | 0 |
| 0.8881944444444444 | 0 |
| 0.8888888888888888 | 0 |
| 0.8895833333333334 | 0 |
| 0.8902777777777778 | 0 |
| 0.8909722222222222 | 0 |
| 0.8916666666666666 | 0 |
| 0.8923611111111112 | 0 |
| 0.8930555555555556 | 0 |
| 0.8937499999999999 | 0 |
| 0.8944444444444444 | 0 |
| 0.8951388888888889 | 0 |
| 0.8958333333333334 | 0 |
| 0.8965277777777777 | 0 |
| 0.8972222222222223 | 0 |
| 0.8979166666666667 | 0 |
| 0.8986111111111111 | 0 |
| 0.8993055555555555 | 0 |
| 0.9 | 0 |
| 0.9006944444444445 | 0 |
| 0.9013888888888889 | 0 |
| 0.9020833333333332 | 0 |
| 0.9027777777777778 | 0 |
| 0.9034722222222222 | 0 |
| 0.9041666666666667 | 0 |
| 0.904861111111111 | 0 |
| 0.9055555555555556 | 0 |
| 0.90625 | 0 |
| 0.9069444444444444 | 0 |
| 0.907638888888889 | 0 |
| 0.9083333333333333 | 0 |
| 0.9090277777777778 | 0 |
| 0.9097222222222222 | 0 |
| 0.9104166666666668 | 0 |
| 0.9111111111111111 | 0 |
| 0.9118055555555555 | 0 |
| 0.9125 | 0 |
| 0.9131944444444445 | 0 |
| 0.9138888888888889 | 0 |
| 0.9145833333333333 | 0 |
| 0.9152777777777777 | 0 |
| 0.9159722222222223 | 0 |
| 0.9166666666666666 | 0 |
| 0.9173611111111111 | 0 |
| 0.9180555555555556 | 0 |
| 0.9187500000000001 | 0 |
| 0.9194444444444444 | 0 |
| 0.9201388888888888 | 0 |
| 0.9208333333333334 | 0 |
| 0.9215277777777778 | 0 |
| 0.9222222222222222 | 0 |
| 0.9229166666666666 | 0 |
| 0.9236111111111112 | 0 |
| 0.9243055555555556 | 0 |
| 0.9249999999999999 | 0 |
| 0.9256944444444444 | 0 |
| 0.9263888888888889 | 0 |
| 0.9270833333333334 | 0 |
| 0.9277777777777777 | 0 |
| 0.9284722222222223 | 0 |
| 0.9291666666666667 | 0 |
| 0.9298611111111111 | 0 |
| 0.9305555555555555 | 0 |
| 0.93125 | 0 |
| 0.9319444444444445 | 0 |
| 0.9326388888888889 | 0 |
| 0.9333333333333332 | 0 |
| 0.9340277777777778 | 0 |
| 0.9347222222222222 | 0 |
| 0.9354166666666667 | 0 |
| 0.936111111111111 | 0 |
| 0.9368055555555556 | 0 |
| 0.9375 | 0 |
| 0.9381944444444444 | 0 |
| 0.938888888888889 | 0 |
| 0.9395833333333333 | 0 |
| 0.9402777777777778 | 0 |
| 0.9409722222222222 | 0 |
| 0.9416666666666668 | 0 |
| 0.9423611111111111 | 0 |
| 0.9430555555555555 | 0 |
| 0.94375 | 0 |
| 0.9444444444444445 | 0 |
| 0.9451388888888889 | 0 |
| 0.9458333333333333 | 0 |
| 0.9465277777777777 | 0 |
| 0.9472222222222223 | 0 |
| 0.9479166666666666 | 0 |
| 0.9486111111111111 | 0 |
| 0.9493055555555556 | 0 |
| 0.9500000000000001 | 0 |
| 0.9506944444444444 | 0 |
| 0.9513888888888888 | 0 |
| 0.9520833333333334 | 0 |
| 0.9527777777777778 | 0 |
| 0.9534722222222222 | 0 |
| 0.9541666666666666 | 0 |
| 0.9548611111111112 | 0 |
| 0.9555555555555556 | 0 |
| 0.9562499999999999 | 0 |
| 0.9569444444444444 | 0 |
| 0.9576388888888889 | 0 |
| 0.9583333333333334 | 0 |
| 0.9590277777777777 | 0 |
| 0.9597222222222223 | 0 |
| 0.9604166666666667 | 0 |
| 0.9611111111111111 | 0 |
| 0.9618055555555555 | 0 |
| 0.9625 | 0 |
| 0.9631944444444445 | 0 |
| 0.9638888888888889 | 0 |
| 0.9645833333333332 | 0 |
| 0.9652777777777778 | 0 |
| 0.9659722222222222 | 0 |
| 0.9666666666666667 | 0 |
| 0.967361111111111 | 0 |
| 0.9680555555555556 | 0 |
| 0.96875 | 0 |
| 0.9694444444444444 | 0 |
| 0.970138888888889 | 0 |
| 0.9708333333333333 | 0 |
| 0.9715277777777778 | 0 |
| 0.9722222222222222 | 0 |
| 0.9729166666666668 | 0 |
| 0.9736111111111111 | 0 |
| 0.9743055555555555 | 0 |
| 0.975 | 0 |
| 0.9756944444444445 | 0 |
| 0.9763888888888889 | 0 |
| 0.9770833333333333 | 0 |
| 0.9777777777777777 | 0 |
| 0.9784722222222223 | 0 |
| 0.9791666666666666 | 0 |
| 0.9798611111111111 | 0 |
| 0.9805555555555556 | 0 |
| 0.9812500000000001 | 0 |
| 0.9819444444444444 | 0 |
| 0.9826388888888888 | 0 |
| 0.9833333333333334 | 0 |
| 0.9840277777777778 | 0 |
| 0.9847222222222222 | 0 |
| 0.9854166666666666 | 0 |
| 0.9861111111111112 | 0 |
| 0.9868055555555556 | 0 |
| 0.9874999999999999 | 0 |
| 0.9881944444444444 | 0 |
| 0.9888888888888889 | 0 |
| 0.9895833333333334 | 0 |
| 0.9902777777777777 | 0 |
| 0.9909722222222223 | 0 |
| 0.9916666666666667 | 0 |
| 0.9923611111111111 | 0 |
| 0.9930555555555555 | 0 |
| 0.99375 | 0 |
| 0.9944444444444445 | 0 |
| 0.9951388888888889 | 0 |
| 0.9958333333333332 | 0 |
| 0.9965277777777778 | 0 |
| 0.9972222222222222 | 0 |
| 0.9979166666666667 | 0 |
| 0.998611111111111 | 0 |
| 0.9993055555555556 | 0 |